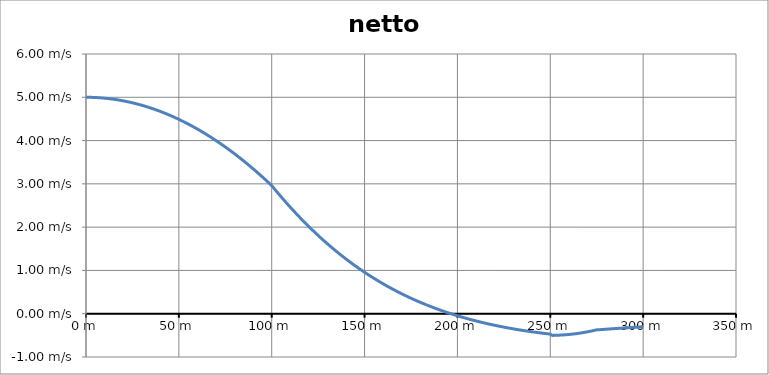
| Category | rychlost |
|---|---|
| 0.0 | 1900-01-05 |
| 1.0 | 1900-01-04 23:59:42 |
| 2.0 | 1900-01-04 23:58:49 |
| 3.0 | 1900-01-04 23:57:21 |
| 4.0 | 1900-01-04 23:55:17 |
| 5.0 | 1900-01-04 23:52:39 |
| 6.0 | 1900-01-04 23:49:25 |
| 7.0 | 1900-01-04 23:45:36 |
| 8.0 | 1900-01-04 23:41:11 |
| 9.0 | 1900-01-04 23:36:11 |
| 10.0 | 1900-01-04 23:30:36 |
| 11.0 | 1900-01-04 23:24:26 |
| 12.0 | 1900-01-04 23:17:40 |
| 13.0 | 1900-01-04 23:10:20 |
| 14.0 | 1900-01-04 23:02:24 |
| 15.0 | 1900-01-04 22:53:52 |
| 16.0 | 1900-01-04 22:44:46 |
| 17.0 | 1900-01-04 22:35:04 |
| 18.0 | 1900-01-04 22:24:47 |
| 19.0 | 1900-01-04 22:13:54 |
| 20.0 | 1900-01-04 22:02:26 |
| 21.0 | 1900-01-04 21:50:24 |
| 22.0 | 1900-01-04 21:37:45 |
| 23.0 | 1900-01-04 21:24:32 |
| 24.0 | 1900-01-04 21:10:43 |
| 25.0 | 1900-01-04 20:56:19 |
| 26.0 | 1900-01-04 20:41:20 |
| 27.0 | 1900-01-04 20:25:45 |
| 28.0 | 1900-01-04 20:09:36 |
| 29.0 | 1900-01-04 19:52:50 |
| 30.0 | 1900-01-04 19:35:30 |
| 31.0 | 1900-01-04 19:17:35 |
| 32.0 | 1900-01-04 18:59:04 |
| 33.0 | 1900-01-04 18:39:58 |
| 34.0 | 1900-01-04 18:20:16 |
| 35.0 | 1900-01-04 18:00:00 |
| 36.0 | 1900-01-04 17:39:08 |
| 37.0 | 1900-01-04 17:17:40 |
| 38.0 | 1900-01-04 16:55:38 |
| 39.0 | 1900-01-04 16:33:00 |
| 40.0 | 1900-01-04 16:09:47 |
| 41.0 | 1900-01-04 15:45:59 |
| 42.0 | 1900-01-04 15:21:36 |
| 43.0 | 1900-01-04 14:56:37 |
| 44.0 | 1900-01-04 14:31:03 |
| 45.0 | 1900-01-04 14:04:53 |
| 46.0 | 1900-01-04 13:38:09 |
| 47.0 | 1900-01-04 13:10:49 |
| 48.0 | 1900-01-04 12:42:54 |
| 49.0 | 1900-01-04 12:14:24 |
| 50.0 | 1900-01-04 11:45:18 |
| 51.0 | 1900-01-04 11:15:37 |
| 52.0 | 1900-01-04 10:45:21 |
| 53.0 | 1900-01-04 10:14:29 |
| 54.0 | 1900-01-04 09:43:03 |
| 55.0 | 1900-01-04 09:11:01 |
| 56.0 | 1900-01-04 08:38:24 |
| 57.0 | 1900-01-04 08:05:11 |
| 58.0 | 1900-01-04 07:31:23 |
| 59.0 | 1900-01-04 06:57:00 |
| 60.0 | 1900-01-04 06:22:02 |
| 61.0 | 1900-01-04 05:46:28 |
| 62.0 | 1900-01-04 05:10:20 |
| 63.0 | 1900-01-04 04:33:36 |
| 64.0 | 1900-01-04 03:56:16 |
| 65.0 | 1900-01-04 03:18:22 |
| 66.0 | 1900-01-04 02:39:52 |
| 67.0 | 1900-01-04 02:00:47 |
| 68.0 | 1900-01-04 01:21:06 |
| 69.0 | 1900-01-04 00:40:50 |
| 70.0 | 1900-01-04 |
| 71.0 | 1900-01-03 23:18:33 |
| 72.0 | 1900-01-03 22:36:32 |
| 73.0 | 1900-01-03 21:53:55 |
| 74.0 | 1900-01-03 21:10:43 |
| 75.0 | 1900-01-03 20:26:56 |
| 76.0 | 1900-01-03 19:42:33 |
| 77.0 | 1900-01-03 18:57:36 |
| 78.0 | 1900-01-03 18:12:02 |
| 79.0 | 1900-01-03 17:25:54 |
| 80.0 | 1900-01-03 16:39:11 |
| 81.0 | 1900-01-03 15:51:52 |
| 82.0 | 1900-01-03 15:03:58 |
| 83.0 | 1900-01-03 14:15:28 |
| 84.0 | 1900-01-03 13:26:24 |
| 85.0 | 1900-01-03 12:36:44 |
| 86.0 | 1900-01-03 11:46:28 |
| 87.0 | 1900-01-03 10:55:38 |
| 88.0 | 1900-01-03 10:04:12 |
| 89.0 | 1900-01-03 09:12:11 |
| 90.0 | 1900-01-03 08:19:35 |
| 91.0 | 1900-01-03 07:26:24 |
| 92.0 | 1900-01-03 06:32:37 |
| 93.0 | 1900-01-03 05:38:15 |
| 94.0 | 1900-01-03 04:43:17 |
| 95.0 | 1900-01-03 03:47:45 |
| 96.0 | 1900-01-03 02:51:37 |
| 97.0 | 1900-01-03 01:54:54 |
| 98.0 | 1900-01-03 00:57:36 |
| 99.0 | 1900-01-02 23:59:42 |
| 100.0 | 1900-01-02 23:01:13 |
| 101.0 | 1900-01-02 21:47:25 |
| 102.0 | 1900-01-02 20:32:51 |
| 103.0 | 1900-01-02 19:19:01 |
| 104.0 | 1900-01-02 18:05:57 |
| 105.0 | 1900-01-02 16:53:38 |
| 106.0 | 1900-01-02 15:42:04 |
| 107.0 | 1900-01-02 14:31:15 |
| 108.0 | 1900-01-02 13:21:11 |
| 109.0 | 1900-01-02 12:11:52 |
| 110.0 | 1900-01-02 11:03:18 |
| 111.0 | 1900-01-02 09:55:28 |
| 112.0 | 1900-01-02 08:48:24 |
| 113.0 | 1900-01-02 07:42:04 |
| 114.0 | 1900-01-02 06:36:28 |
| 115.0 | 1900-01-02 05:31:37 |
| 116.0 | 1900-01-02 04:27:29 |
| 117.0 | 1900-01-02 03:24:06 |
| 118.0 | 1900-01-02 02:21:27 |
| 119.0 | 1900-01-02 01:19:31 |
| 120.0 | 1900-01-02 00:18:18 |
| 121.0 | 1900-01-01 23:17:49 |
| 122.0 | 1900-01-01 22:18:03 |
| 123.0 | 1900-01-01 21:19:00 |
| 124.0 | 1900-01-01 20:20:39 |
| 125.0 | 1900-01-01 19:23:01 |
| 126.0 | 1900-01-01 18:26:04 |
| 127.0 | 1900-01-01 17:29:50 |
| 128.0 | 1900-01-01 16:34:17 |
| 129.0 | 1900-01-01 15:39:26 |
| 130.0 | 1900-01-01 14:45:16 |
| 131.0 | 1900-01-01 13:51:46 |
| 132.0 | 1900-01-01 12:58:57 |
| 133.0 | 1900-01-01 12:06:49 |
| 134.0 | 1900-01-01 11:15:20 |
| 135.0 | 1900-01-01 10:24:31 |
| 136.0 | 1900-01-01 09:34:22 |
| 137.0 | 1900-01-01 08:44:52 |
| 138.0 | 1900-01-01 07:56:00 |
| 139.0 | 1900-01-01 07:07:48 |
| 140.0 | 1900-01-01 06:20:13 |
| 141.0 | 1900-01-01 05:33:16 |
| 142.0 | 1900-01-01 04:46:57 |
| 143.0 | 1900-01-01 04:01:16 |
| 144.0 | 1900-01-01 03:16:11 |
| 145.0 | 1900-01-01 02:31:43 |
| 146.0 | 1900-01-01 01:47:51 |
| 147.0 | 1900-01-01 01:04:36 |
| 148.0 | 1900-01-01 00:21:56 |
| 149.0 | 0.986 |
| 150.0 | 0.957 |
| 151.0 | 0.929 |
| 152.0 | 0.901 |
| 153.0 | 0.873 |
| 154.0 | 0.846 |
| 155.0 | 0.819 |
| 156.0 | 0.793 |
| 157.0 | 0.767 |
| 158.0 | 0.741 |
| 159.0 | 0.716 |
| 160.0 | 0.691 |
| 161.0 | 0.666 |
| 162.0 | 0.642 |
| 163.0 | 0.618 |
| 164.0 | 0.594 |
| 165.0 | 0.571 |
| 166.0 | 0.548 |
| 167.0 | 0.526 |
| 168.0 | 0.504 |
| 169.0 | 0.482 |
| 170.0 | 0.46 |
| 171.0 | 0.439 |
| 172.0 | 0.418 |
| 173.0 | 0.398 |
| 174.0 | 0.378 |
| 175.0 | 0.358 |
| 176.0 | 0.338 |
| 177.0 | 0.319 |
| 178.0 | 0.3 |
| 179.0 | 0.281 |
| 180.0 | 0.263 |
| 181.0 | 0.245 |
| 182.0 | 0.227 |
| 183.0 | 0.21 |
| 184.0 | 0.193 |
| 185.0 | 0.176 |
| 186.0 | 0.159 |
| 187.0 | 0.143 |
| 188.0 | 0.126 |
| 189.0 | 0.111 |
| 190.0 | 0.095 |
| 191.0 | 0.08 |
| 192.0 | 0.065 |
| 193.0 | 0.05 |
| 194.0 | 0.035 |
| 195.0 | 0.021 |
| 196.0 | 0.007 |
| 197.0 | -0.007 |
| 198.0 | -0.021 |
| 199.0 | -0.034 |
| 200.0 | -0.047 |
| 201.0 | -0.06 |
| 202.0 | -0.073 |
| 203.0 | -0.085 |
| 204.0 | -0.098 |
| 205.0 | -0.11 |
| 206.0 | -0.122 |
| 207.0 | -0.133 |
| 208.0 | -0.145 |
| 209.0 | -0.156 |
| 210.0 | -0.167 |
| 211.0 | -0.178 |
| 212.0 | -0.188 |
| 213.0 | -0.199 |
| 214.0 | -0.209 |
| 215.0 | -0.219 |
| 216.0 | -0.229 |
| 217.0 | -0.239 |
| 218.0 | -0.248 |
| 219.0 | -0.257 |
| 220.0 | -0.267 |
| 221.0 | -0.276 |
| 222.0 | -0.284 |
| 223.0 | -0.293 |
| 224.0 | -0.302 |
| 225.0 | -0.31 |
| 226.0 | -0.318 |
| 227.0 | -0.326 |
| 228.0 | -0.334 |
| 229.0 | -0.342 |
| 230.0 | -0.349 |
| 231.0 | -0.356 |
| 232.0 | -0.364 |
| 233.0 | -0.371 |
| 234.0 | -0.378 |
| 235.0 | -0.384 |
| 236.0 | -0.391 |
| 237.0 | -0.398 |
| 238.0 | -0.404 |
| 239.0 | -0.41 |
| 240.0 | -0.416 |
| 241.0 | -0.422 |
| 242.0 | -0.428 |
| 243.0 | -0.434 |
| 244.0 | -0.44 |
| 245.0 | -0.445 |
| 246.0 | -0.451 |
| 247.0 | -0.456 |
| 248.0 | -0.461 |
| 249.0 | -0.466 |
| 250.0 | -0.471 |
| 251.0 | -0.5 |
| 252.0 | -0.499 |
| 253.0 | -0.498 |
| 254.0 | -0.497 |
| 255.0 | -0.495 |
| 256.0 | -0.493 |
| 257.0 | -0.49 |
| 258.0 | -0.487 |
| 259.0 | -0.483 |
| 260.0 | -0.48 |
| 261.0 | -0.475 |
| 262.0 | -0.471 |
| 263.0 | -0.466 |
| 264.0 | -0.46 |
| 265.0 | -0.454 |
| 266.0 | -0.448 |
| 267.0 | -0.441 |
| 268.0 | -0.434 |
| 269.0 | -0.426 |
| 270.0 | -0.418 |
| 271.0 | -0.41 |
| 272.0 | -0.401 |
| 273.0 | -0.392 |
| 274.0 | -0.382 |
| 275.0 | -0.372 |
| 276.0 | -0.371 |
| 277.0 | -0.368 |
| 278.0 | -0.365 |
| 279.0 | -0.361 |
| 280.0 | -0.358 |
| 281.0 | -0.355 |
| 282.0 | -0.352 |
| 283.0 | -0.349 |
| 284.0 | -0.346 |
| 285.0 | -0.343 |
| 286.0 | -0.34 |
| 287.0 | -0.337 |
| 288.0 | -0.334 |
| 289.0 | -0.331 |
| 290.0 | -0.329 |
| 291.0 | -0.326 |
| 292.0 | -0.323 |
| 293.0 | -0.32 |
| 294.0 | -0.317 |
| 295.0 | -0.314 |
| 296.0 | -0.312 |
| 297.0 | -0.309 |
| 298.0 | -0.306 |
| 299.0 | -0.303 |
| 300.0 | -0.301 |